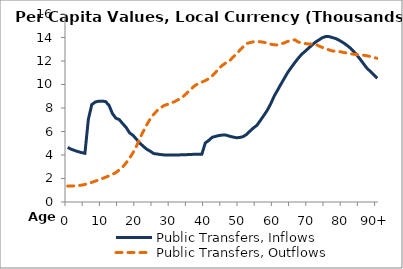
| Category | Public Transfers, Inflows | Public Transfers, Outflows |
|---|---|---|
| 0 | 4643.257 | 1355.105 |
|  | 4492.557 | 1364.557 |
| 2 | 4386.947 | 1374.009 |
| 3 | 4289.447 | 1394.329 |
| 4 | 4205.095 | 1433.026 |
| 5 | 4146.658 | 1494.288 |
| 6 | 7037.892 | 1577.44 |
| 7 | 8293.485 | 1672.121 |
| 8 | 8507.41 | 1773.793 |
| 9 | 8576.326 | 1880.815 |
| 10 | 8585.977 | 1993.318 |
| 11 | 8545.339 | 2104.73 |
| 12 | 8233.453 | 2224.863 |
| 13 | 7525.163 | 2356.137 |
| 14 | 7131.263 | 2497.675 |
| 15 | 7012.005 | 2739.833 |
| 16 | 6661.712 | 2980.472 |
| 17 | 6337.818 | 3340.909 |
| 18 | 5878.682 | 3732.839 |
| 19 | 5668.971 | 4205.903 |
| 20 | 5337.968 | 4755.003 |
| 21 | 4999.913 | 5435.788 |
| 22 | 4732.09 | 6027.604 |
| 23 | 4486.022 | 6583.837 |
| 24 | 4322.643 | 7089.717 |
| 25 | 4121.171 | 7459.161 |
| 26 | 4086.223 | 7775.978 |
| 27 | 4037.628 | 8008.223 |
| 28 | 4009.774 | 8211.614 |
| 29 | 4007.739 | 8306.649 |
| 30 | 4003.783 | 8423.562 |
| 31 | 4000.07 | 8531.763 |
| 32 | 4005.018 | 8686.703 |
| 33 | 4013.976 | 8854.104 |
| 34 | 4020.872 | 9090.954 |
| 35 | 4035.629 | 9371.855 |
| 36 | 4049.737 | 9646.576 |
| 37 | 4061.46 | 9918.154 |
| 38 | 4067.251 | 10072.262 |
| 39 | 4073.443 | 10203.919 |
| 40 | 5025.193 | 10329.212 |
| 41 | 5239.513 | 10498.347 |
| 42 | 5507.143 | 10727.246 |
| 43 | 5587.809 | 11034.707 |
| 44 | 5660.246 | 11381.092 |
| 45 | 5698.46 | 11636.844 |
| 46 | 5696.034 | 11849.05 |
| 47 | 5603.778 | 11984.213 |
| 48 | 5532.788 | 12318.007 |
| 49 | 5467.743 | 12584.877 |
| 50 | 5488.943 | 12904.897 |
| 51 | 5564.957 | 13207.866 |
| 52 | 5748.324 | 13485.366 |
| 53 | 6035.611 | 13564.449 |
| 54 | 6302.811 | 13634.389 |
| 55 | 6524.263 | 13662.447 |
| 56 | 6934.63 | 13637.789 |
| 57 | 7356.049 | 13590.481 |
| 58 | 7795.291 | 13524.236 |
| 59 | 8341.956 | 13432.857 |
| 60 | 8997.351 | 13377.334 |
| 61 | 9511.066 | 13364.075 |
| 62 | 10031.999 | 13456.706 |
| 63 | 10541.391 | 13549.484 |
| 64 | 11040.718 | 13674.237 |
| 65 | 11451.346 | 13743.442 |
| 66 | 11855.836 | 13803.85 |
| 67 | 12228.731 | 13623.43 |
| 68 | 12569.157 | 13534.945 |
| 69 | 12817.844 | 13485.534 |
| 70 | 13087.773 | 13449.437 |
| 71 | 13349.638 | 13442.859 |
| 72 | 13602.299 | 13422.84 |
| 73 | 13787.679 | 13286.066 |
| 74 | 13978.43 | 13156.007 |
| 75 | 14077.942 | 13044.678 |
| 76 | 14074.169 | 12942.214 |
| 77 | 13987.996 | 12852.794 |
| 78 | 13903.055 | 12830.098 |
| 79 | 13749.831 | 12798.394 |
| 80 | 13577.724 | 12743.281 |
| 81 | 13377.134 | 12685.742 |
| 82 | 13141.028 | 12629.885 |
| 83 | 12855.039 | 12581.916 |
| 84 | 12527.768 | 12548.318 |
| 85 | 12164.891 | 12525.543 |
| 86 | 11768.64 | 12491.234 |
| 87 | 11384.406 | 12444.641 |
| 88 | 11112.549 | 12378.69 |
| 89 | 10821.397 | 12296.784 |
| 90+ | 10530.244 | 12225.773 |